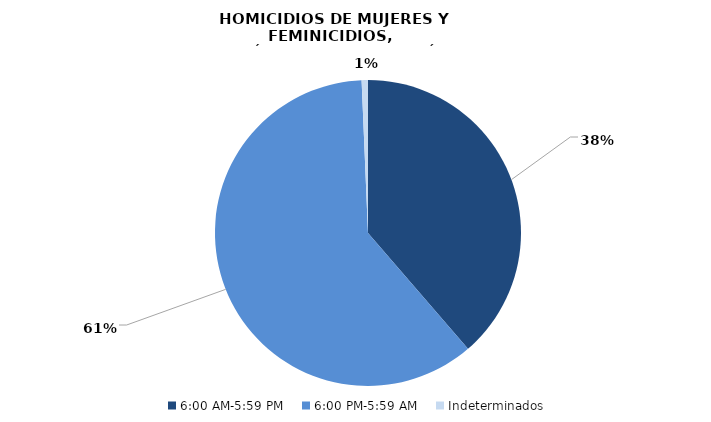
| Category | Series 0 |
|---|---|
| 6:00 AM-5:59 PM | 58 |
| 6:00 PM-5:59 AM | 91 |
| Indeterminados | 1 |